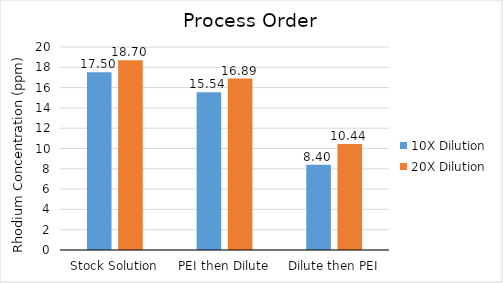
| Category | 10X Dilution | 20X Dilution |
|---|---|---|
| Stock Solution | 17.503 | 18.703 |
| PEI then Dilute | 15.537 | 16.886 |
| Dilute then PEI | 8.398 | 10.441 |